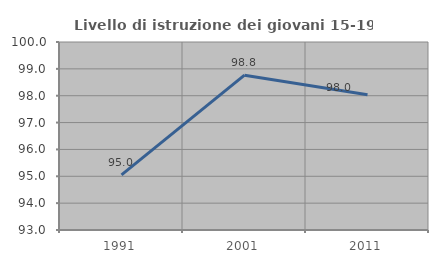
| Category | Livello di istruzione dei giovani 15-19 anni |
|---|---|
| 1991.0 | 95.05 |
| 2001.0 | 98.765 |
| 2011.0 | 98.039 |